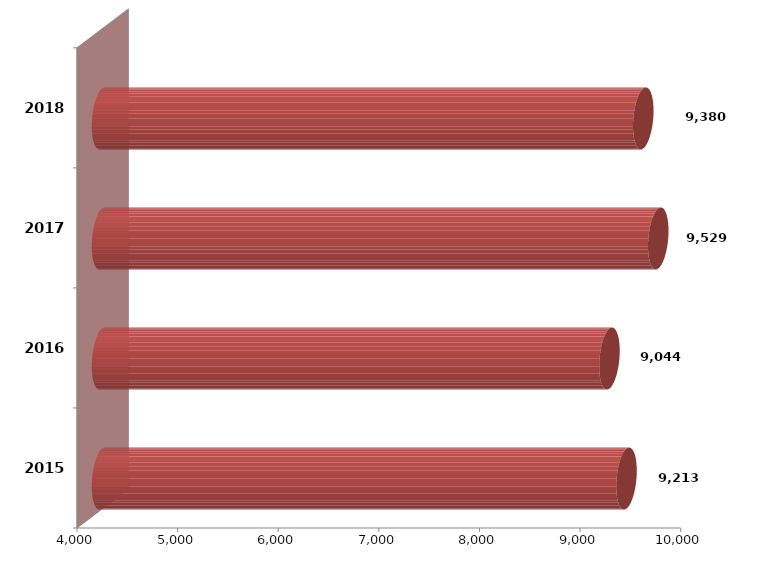
| Category | Series 1 | Series 2 |
|---|---|---|
| 2015.0 | 9213152 |  |
| 2016.0 | 9043605.283 |  |
| 2017.0 | 9528784.616 |  |
| 2018.0 | 9379792.504 |  |